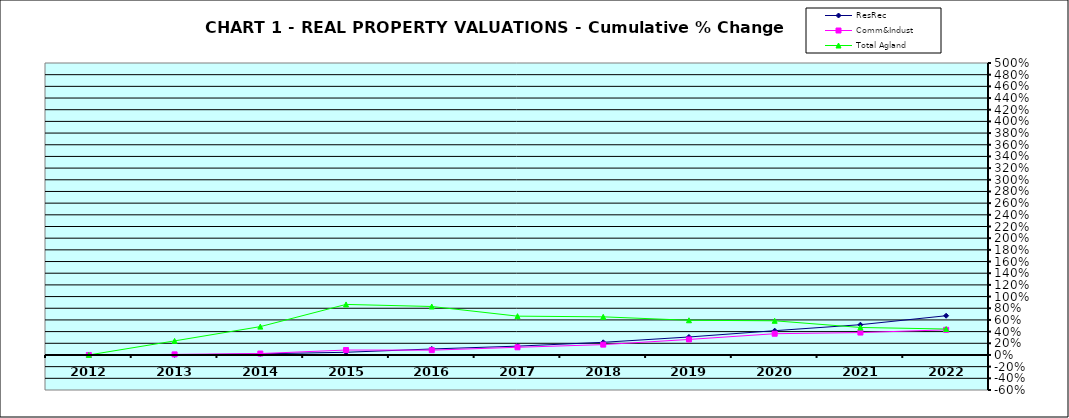
| Category | ResRec | Comm&Indust | Total Agland |
|---|---|---|---|
| 2012.0 | 0 | 0 | 0 |
| 2013.0 | 0.002 | 0.01 | 0.241 |
| 2014.0 | 0.019 | 0.024 | 0.485 |
| 2015.0 | 0.046 | 0.084 | 0.865 |
| 2016.0 | 0.103 | 0.082 | 0.83 |
| 2017.0 | 0.151 | 0.131 | 0.665 |
| 2018.0 | 0.217 | 0.177 | 0.653 |
| 2019.0 | 0.308 | 0.266 | 0.594 |
| 2020.0 | 0.416 | 0.364 | 0.585 |
| 2021.0 | 0.518 | 0.384 | 0.471 |
| 2022.0 | 0.672 | 0.43 | 0.445 |